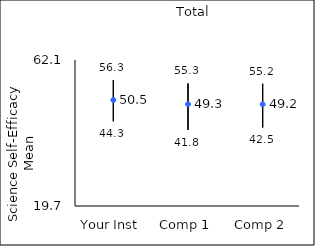
| Category | 25th percentile | 75th percentile | Mean |
|---|---|---|---|
| Your Inst | 44.3 | 56.3 | 50.47 |
| Comp 1 | 41.8 | 55.3 | 49.28 |
| Comp 2 | 42.5 | 55.2 | 49.22 |